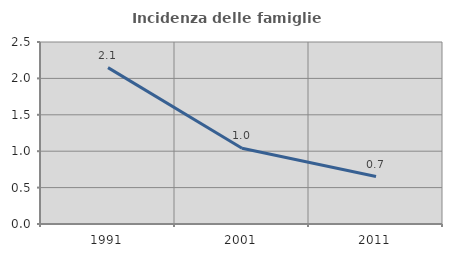
| Category | Incidenza delle famiglie numerose |
|---|---|
| 1991.0 | 2.148 |
| 2001.0 | 1.041 |
| 2011.0 | 0.652 |